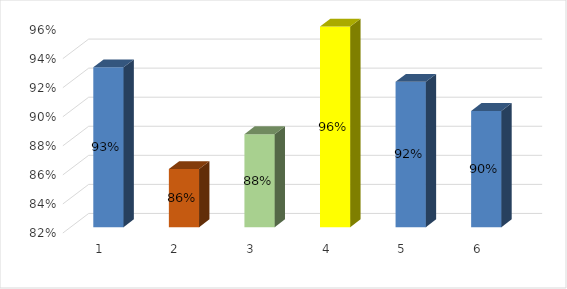
| Category | Series 0 | Series 1 | Series 2 | Series 3 |
|---|---|---|---|---|
| 0 | 0.93 |  |  |  |
| 1 | 0.86 |  |  |  |
| 2 | 0.884 |  |  |  |
| 3 | 0.958 |  |  |  |
| 4 | 0.92 |  |  |  |
| 5 | 0.9 |  |  |  |